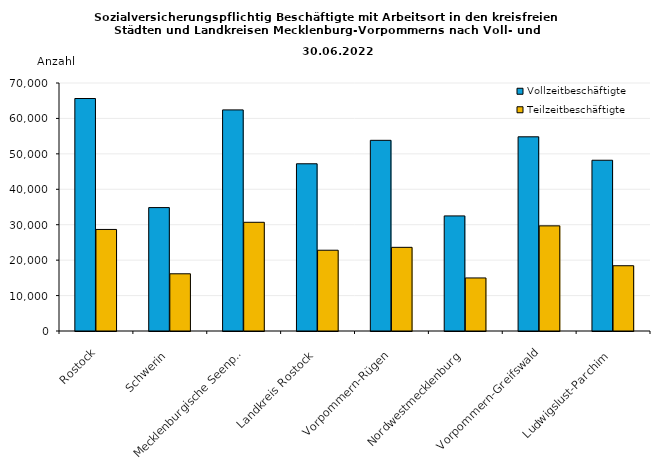
| Category | Vollzeitbeschäftigte | Teilzeitbeschäftigte |
|---|---|---|
|    Rostock | 65624 | 28663 |
|    Schwerin | 34835 | 16149 |
|    Mecklenburgische Seenplatte | 62406 | 30684 |
|    Landkreis Rostock | 47201 | 22801 |
|    Vorpommern-Rügen | 53821 | 23616 |
|    Nordwestmecklenburg | 32486 | 14974 |
|    Vorpommern-Greifswald | 54812 | 29678 |
|    Ludwigslust-Parchim | 48198 | 18425 |